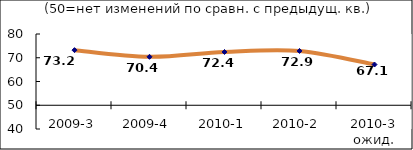
| Category | Диф.индекс ↓ |
|---|---|
| 2009-3 | 73.205 |
| 2009-4 | 70.39 |
| 2010-1 | 72.43 |
| 2010-2 | 72.86 |
| 2010-3 ожид. | 67.145 |